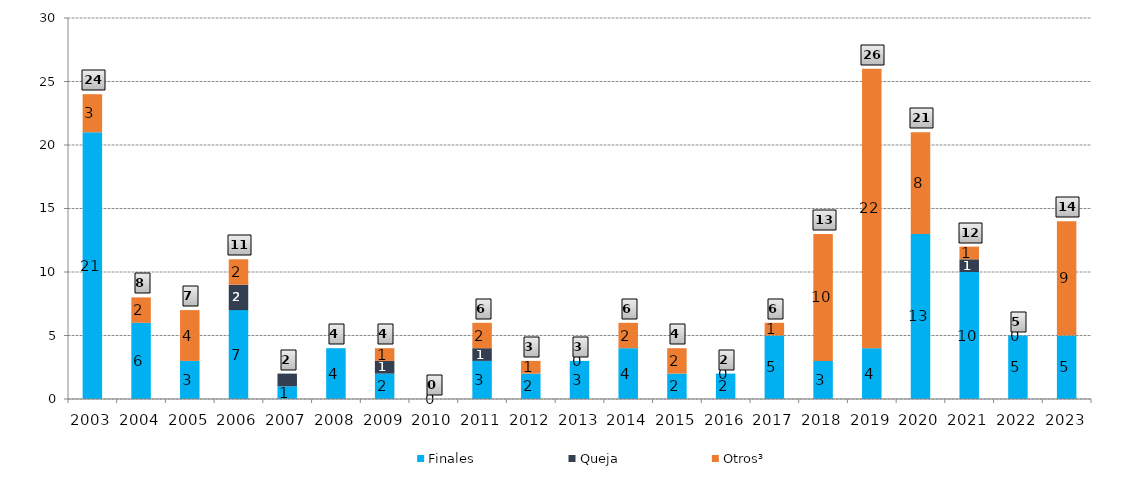
| Category | Finales | Queja | Otros³ |
|---|---|---|---|
| 2003.0 | 21 | 0 | 3 |
| 2004.0 | 6 | 0 | 2 |
| 2005.0 | 3 | 0 | 4 |
| 2006.0 | 7 | 2 | 2 |
| 2007.0 | 1 | 1 | 0 |
| 2008.0 | 4 | 0 | 0 |
| 2009.0 | 2 | 1 | 1 |
| 2010.0 | 0 | 0 | 0 |
| 2011.0 | 3 | 1 | 2 |
| 2012.0 | 2 | 0 | 1 |
| 2013.0 | 3 | 0 | 0 |
| 2014.0 | 4 | 0 | 2 |
| 2015.0 | 2 | 0 | 2 |
| 2016.0 | 2 | 0 | 0 |
| 2017.0 | 5 | 0 | 1 |
| 2018.0 | 3 | 0 | 10 |
| 2019.0 | 4 | 0 | 22 |
| 2020.0 | 13 | 0 | 8 |
| 2021.0 | 10 | 1 | 1 |
| 2022.0 | 5 | 0 | 0 |
| 2023.0 | 5 | 0 | 9 |